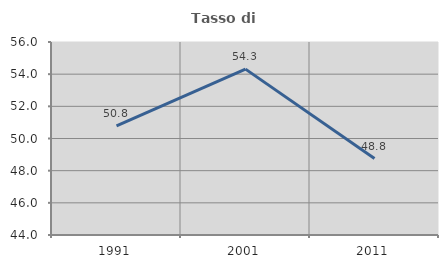
| Category | Tasso di occupazione   |
|---|---|
| 1991.0 | 50.778 |
| 2001.0 | 54.314 |
| 2011.0 | 48.751 |